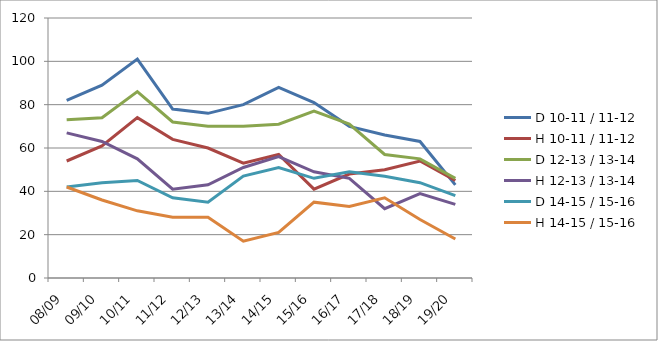
| Category | D 10-11 / 11-12 | H 10-11 / 11-12 | D 12-13 / 13-14 | H 12-13 / 13-14 | D 14-15 / 15-16 | H 14-15 / 15-16 |
|---|---|---|---|---|---|---|
| 08/09 | 82 | 54 | 73 | 67 | 42 | 42 |
| 09/10 | 89 | 61 | 74 | 63 | 44 | 36 |
| 10/11 | 101 | 74 | 86 | 55 | 45 | 31 |
| 11/12 | 78 | 64 | 72 | 41 | 37 | 28 |
| 12/13 | 76 | 60 | 70 | 43 | 35 | 28 |
| 13/14 | 80 | 53 | 70 | 51 | 47 | 17 |
| 14/15 | 88 | 57 | 71 | 56 | 51 | 21 |
| 15/16 | 81 | 41 | 77 | 49 | 46 | 35 |
| 16/17 | 70 | 48 | 71 | 46 | 49 | 33 |
| 17/18 | 66 | 50 | 57 | 32 | 47 | 37 |
| 18/19 | 63 | 54 | 55 | 39 | 44 | 27 |
| 19/20 | 43 | 45 | 46 | 34 | 38 | 18 |